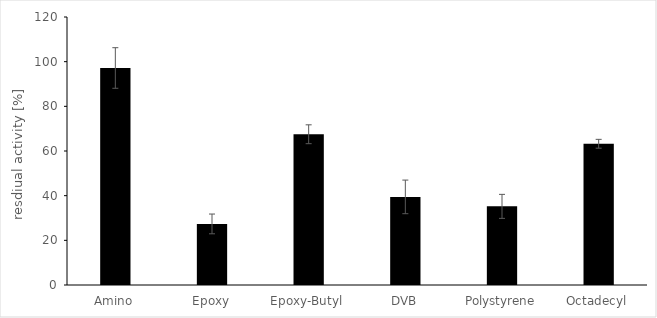
| Category | Series 0 |
|---|---|
| Amino | 97.17 |
| Epoxy | 27.354 |
| Epoxy-Butyl | 67.501 |
| DVB | 39.451 |
| Polystyrene | 35.207 |
| Octadecyl | 63.24 |